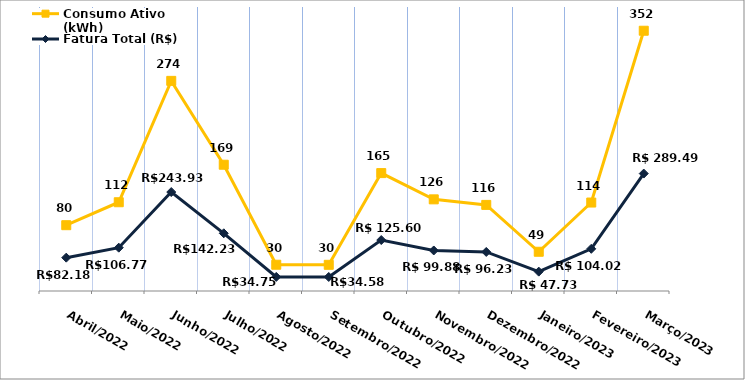
| Category | Fatura Total (R$) | Consumo Ativo (kWh) |
|---|---|---|
| Abril/2022 | 82.18 | 80 |
| Maio/2022 | 106.77 | 112 |
| Junho/2022 | 243.93 | 274 |
| Julho/2022 | 142.23 | 169 |
| Agosto/2022 | 34.75 | 30 |
| Setembro/2022 | 34.58 | 30 |
| Outubro/2022 | 125.6 | 165 |
| Novembro/2022 | 99.88 | 126 |
| Dezembro/2022 | 96.23 | 116 |
| Janeiro/2023 | 47.73 | 49 |
| Fevereiro/2023 | 104.02 | 114 |
| Março/2023 | 289.49 | 352 |